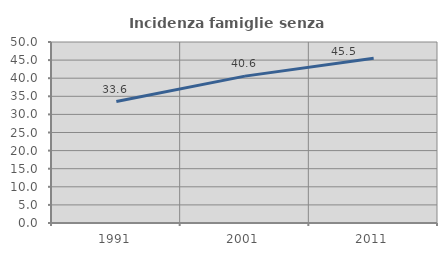
| Category | Incidenza famiglie senza nuclei |
|---|---|
| 1991.0 | 33.56 |
| 2001.0 | 40.57 |
| 2011.0 | 45.516 |